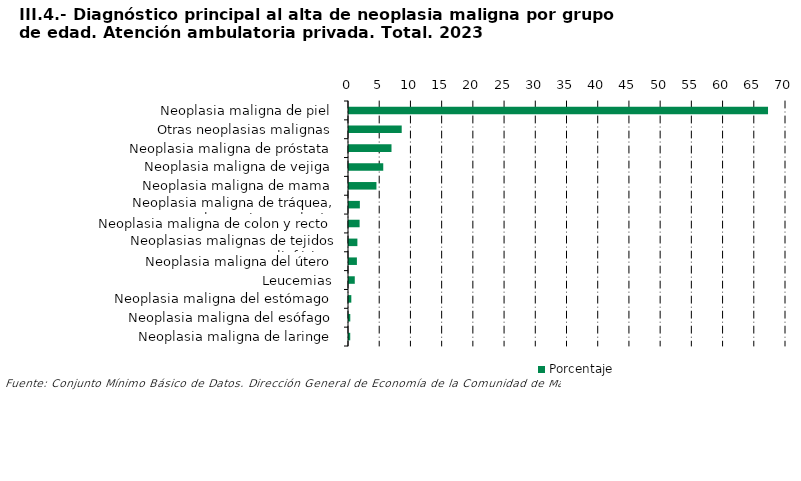
| Category | Porcentaje |
|---|---|
| Neoplasia maligna de piel | 67.12 |
| Otras neoplasias malignas | 8.443 |
| Neoplasia maligna de próstata | 6.807 |
| Neoplasia maligna de vejiga | 5.487 |
| Neoplasia maligna de mama | 4.396 |
| Neoplasia maligna de tráquea, bronquios y pulmón | 1.739 |
| Neoplasia maligna de colon y recto | 1.7 |
| Neoplasias malignas de tejidos linfáticos | 1.344 |
| Neoplasia maligna del útero | 1.265 |
| Leucemias | 0.925 |
| Neoplasia maligna del estómago | 0.372 |
| Neoplasia maligna del esófago | 0.206 |
| Neoplasia maligna de laringe | 0.198 |